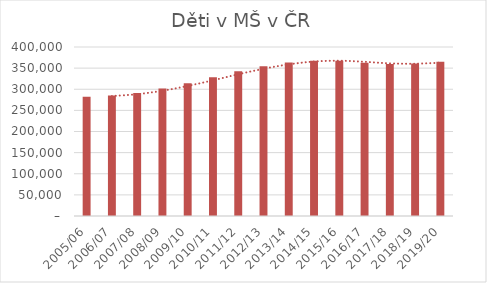
| Category | děti v MŠ v ČR |
|---|---|
| 2005/06 | 282183 |
| 2006/07 | 285419 |
| 2007/08 | 291194 |
| 2008/09 | 301620 |
| 2009/10 | 314008 |
| 2010/11 | 328309 |
| 2011/12 | 342521 |
| 2012/13 | 354340 |
| 2013/14 | 363568 |
| 2014/15 | 367603 |
| 2015/16 | 367361 |
| 2016/17 | 362653 |
| 2017/18 | 359909 |
| 2018/19 | 360915 |
| 2019/20 | 364909 |